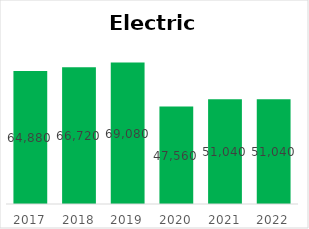
| Category | Series 0 |
|---|---|
| 2017.0 | 64880 |
| 2018.0 | 66720 |
| 2019.0 | 69080 |
| 2020.0 | 47560 |
| 2021.0 | 51040 |
| 2022.0 | 51040 |